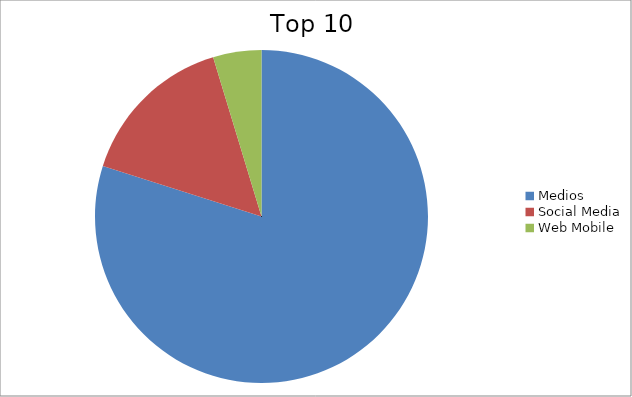
| Category | Series 0 |
|---|---|
| Medios | 79.9 |
| Social Media | 15.4 |
| Web Mobile | 4.69 |